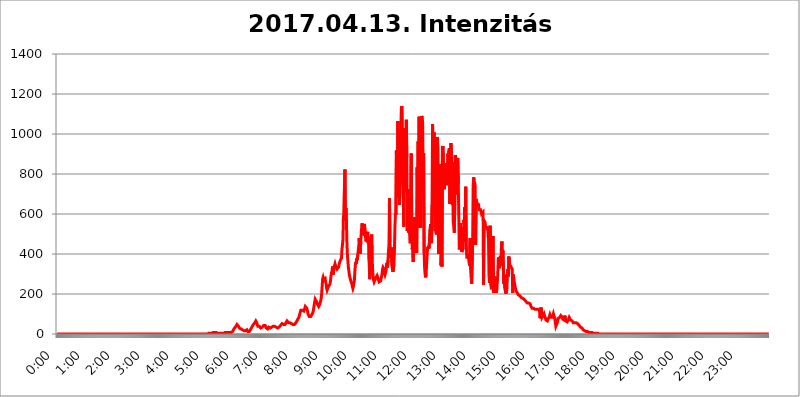
| Category | 2017.04.13. Intenzitás [W/m^2] |
|---|---|
| 0.0 | 0 |
| 0.0006944444444444445 | 0 |
| 0.001388888888888889 | 0 |
| 0.0020833333333333333 | 0 |
| 0.002777777777777778 | 0 |
| 0.003472222222222222 | 0 |
| 0.004166666666666667 | 0 |
| 0.004861111111111111 | 0 |
| 0.005555555555555556 | 0 |
| 0.0062499999999999995 | 0 |
| 0.006944444444444444 | 0 |
| 0.007638888888888889 | 0 |
| 0.008333333333333333 | 0 |
| 0.009027777777777779 | 0 |
| 0.009722222222222222 | 0 |
| 0.010416666666666666 | 0 |
| 0.011111111111111112 | 0 |
| 0.011805555555555555 | 0 |
| 0.012499999999999999 | 0 |
| 0.013194444444444444 | 0 |
| 0.013888888888888888 | 0 |
| 0.014583333333333332 | 0 |
| 0.015277777777777777 | 0 |
| 0.015972222222222224 | 0 |
| 0.016666666666666666 | 0 |
| 0.017361111111111112 | 0 |
| 0.018055555555555557 | 0 |
| 0.01875 | 0 |
| 0.019444444444444445 | 0 |
| 0.02013888888888889 | 0 |
| 0.020833333333333332 | 0 |
| 0.02152777777777778 | 0 |
| 0.022222222222222223 | 0 |
| 0.02291666666666667 | 0 |
| 0.02361111111111111 | 0 |
| 0.024305555555555556 | 0 |
| 0.024999999999999998 | 0 |
| 0.025694444444444447 | 0 |
| 0.02638888888888889 | 0 |
| 0.027083333333333334 | 0 |
| 0.027777777777777776 | 0 |
| 0.02847222222222222 | 0 |
| 0.029166666666666664 | 0 |
| 0.029861111111111113 | 0 |
| 0.030555555555555555 | 0 |
| 0.03125 | 0 |
| 0.03194444444444445 | 0 |
| 0.03263888888888889 | 0 |
| 0.03333333333333333 | 0 |
| 0.034027777777777775 | 0 |
| 0.034722222222222224 | 0 |
| 0.035416666666666666 | 0 |
| 0.036111111111111115 | 0 |
| 0.03680555555555556 | 0 |
| 0.0375 | 0 |
| 0.03819444444444444 | 0 |
| 0.03888888888888889 | 0 |
| 0.03958333333333333 | 0 |
| 0.04027777777777778 | 0 |
| 0.04097222222222222 | 0 |
| 0.041666666666666664 | 0 |
| 0.042361111111111106 | 0 |
| 0.04305555555555556 | 0 |
| 0.043750000000000004 | 0 |
| 0.044444444444444446 | 0 |
| 0.04513888888888889 | 0 |
| 0.04583333333333334 | 0 |
| 0.04652777777777778 | 0 |
| 0.04722222222222222 | 0 |
| 0.04791666666666666 | 0 |
| 0.04861111111111111 | 0 |
| 0.049305555555555554 | 0 |
| 0.049999999999999996 | 0 |
| 0.05069444444444445 | 0 |
| 0.051388888888888894 | 0 |
| 0.052083333333333336 | 0 |
| 0.05277777777777778 | 0 |
| 0.05347222222222222 | 0 |
| 0.05416666666666667 | 0 |
| 0.05486111111111111 | 0 |
| 0.05555555555555555 | 0 |
| 0.05625 | 0 |
| 0.05694444444444444 | 0 |
| 0.057638888888888885 | 0 |
| 0.05833333333333333 | 0 |
| 0.05902777777777778 | 0 |
| 0.059722222222222225 | 0 |
| 0.06041666666666667 | 0 |
| 0.061111111111111116 | 0 |
| 0.06180555555555556 | 0 |
| 0.0625 | 0 |
| 0.06319444444444444 | 0 |
| 0.06388888888888888 | 0 |
| 0.06458333333333334 | 0 |
| 0.06527777777777778 | 0 |
| 0.06597222222222222 | 0 |
| 0.06666666666666667 | 0 |
| 0.06736111111111111 | 0 |
| 0.06805555555555555 | 0 |
| 0.06874999999999999 | 0 |
| 0.06944444444444443 | 0 |
| 0.07013888888888889 | 0 |
| 0.07083333333333333 | 0 |
| 0.07152777777777779 | 0 |
| 0.07222222222222223 | 0 |
| 0.07291666666666667 | 0 |
| 0.07361111111111111 | 0 |
| 0.07430555555555556 | 0 |
| 0.075 | 0 |
| 0.07569444444444444 | 0 |
| 0.0763888888888889 | 0 |
| 0.07708333333333334 | 0 |
| 0.07777777777777778 | 0 |
| 0.07847222222222222 | 0 |
| 0.07916666666666666 | 0 |
| 0.0798611111111111 | 0 |
| 0.08055555555555556 | 0 |
| 0.08125 | 0 |
| 0.08194444444444444 | 0 |
| 0.08263888888888889 | 0 |
| 0.08333333333333333 | 0 |
| 0.08402777777777777 | 0 |
| 0.08472222222222221 | 0 |
| 0.08541666666666665 | 0 |
| 0.08611111111111112 | 0 |
| 0.08680555555555557 | 0 |
| 0.08750000000000001 | 0 |
| 0.08819444444444445 | 0 |
| 0.08888888888888889 | 0 |
| 0.08958333333333333 | 0 |
| 0.09027777777777778 | 0 |
| 0.09097222222222222 | 0 |
| 0.09166666666666667 | 0 |
| 0.09236111111111112 | 0 |
| 0.09305555555555556 | 0 |
| 0.09375 | 0 |
| 0.09444444444444444 | 0 |
| 0.09513888888888888 | 0 |
| 0.09583333333333333 | 0 |
| 0.09652777777777777 | 0 |
| 0.09722222222222222 | 0 |
| 0.09791666666666667 | 0 |
| 0.09861111111111111 | 0 |
| 0.09930555555555555 | 0 |
| 0.09999999999999999 | 0 |
| 0.10069444444444443 | 0 |
| 0.1013888888888889 | 0 |
| 0.10208333333333335 | 0 |
| 0.10277777777777779 | 0 |
| 0.10347222222222223 | 0 |
| 0.10416666666666667 | 0 |
| 0.10486111111111111 | 0 |
| 0.10555555555555556 | 0 |
| 0.10625 | 0 |
| 0.10694444444444444 | 0 |
| 0.1076388888888889 | 0 |
| 0.10833333333333334 | 0 |
| 0.10902777777777778 | 0 |
| 0.10972222222222222 | 0 |
| 0.1111111111111111 | 0 |
| 0.11180555555555556 | 0 |
| 0.11180555555555556 | 0 |
| 0.1125 | 0 |
| 0.11319444444444444 | 0 |
| 0.11388888888888889 | 0 |
| 0.11458333333333333 | 0 |
| 0.11527777777777777 | 0 |
| 0.11597222222222221 | 0 |
| 0.11666666666666665 | 0 |
| 0.1173611111111111 | 0 |
| 0.11805555555555557 | 0 |
| 0.11944444444444445 | 0 |
| 0.12013888888888889 | 0 |
| 0.12083333333333333 | 0 |
| 0.12152777777777778 | 0 |
| 0.12222222222222223 | 0 |
| 0.12291666666666667 | 0 |
| 0.12291666666666667 | 0 |
| 0.12361111111111112 | 0 |
| 0.12430555555555556 | 0 |
| 0.125 | 0 |
| 0.12569444444444444 | 0 |
| 0.12638888888888888 | 0 |
| 0.12708333333333333 | 0 |
| 0.16875 | 0 |
| 0.12847222222222224 | 0 |
| 0.12916666666666668 | 0 |
| 0.12986111111111112 | 0 |
| 0.13055555555555556 | 0 |
| 0.13125 | 0 |
| 0.13194444444444445 | 0 |
| 0.1326388888888889 | 0 |
| 0.13333333333333333 | 0 |
| 0.13402777777777777 | 0 |
| 0.13402777777777777 | 0 |
| 0.13472222222222222 | 0 |
| 0.13541666666666666 | 0 |
| 0.1361111111111111 | 0 |
| 0.13749999999999998 | 0 |
| 0.13819444444444443 | 0 |
| 0.1388888888888889 | 0 |
| 0.13958333333333334 | 0 |
| 0.14027777777777778 | 0 |
| 0.14097222222222222 | 0 |
| 0.14166666666666666 | 0 |
| 0.1423611111111111 | 0 |
| 0.14305555555555557 | 0 |
| 0.14375000000000002 | 0 |
| 0.14444444444444446 | 0 |
| 0.1451388888888889 | 0 |
| 0.1451388888888889 | 0 |
| 0.14652777777777778 | 0 |
| 0.14722222222222223 | 0 |
| 0.14791666666666667 | 0 |
| 0.1486111111111111 | 0 |
| 0.14930555555555555 | 0 |
| 0.15 | 0 |
| 0.15069444444444444 | 0 |
| 0.15138888888888888 | 0 |
| 0.15208333333333332 | 0 |
| 0.15277777777777776 | 0 |
| 0.15347222222222223 | 0 |
| 0.15416666666666667 | 0 |
| 0.15486111111111112 | 0 |
| 0.15555555555555556 | 0 |
| 0.15625 | 0 |
| 0.15694444444444444 | 0 |
| 0.15763888888888888 | 0 |
| 0.15833333333333333 | 0 |
| 0.15902777777777777 | 0 |
| 0.15972222222222224 | 0 |
| 0.16041666666666668 | 0 |
| 0.16111111111111112 | 0 |
| 0.16180555555555556 | 0 |
| 0.1625 | 0 |
| 0.16319444444444445 | 0 |
| 0.1638888888888889 | 0 |
| 0.16458333333333333 | 0 |
| 0.16527777777777777 | 0 |
| 0.16597222222222222 | 0 |
| 0.16666666666666666 | 0 |
| 0.1673611111111111 | 0 |
| 0.16805555555555554 | 0 |
| 0.16874999999999998 | 0 |
| 0.16944444444444443 | 0 |
| 0.17013888888888887 | 0 |
| 0.1708333333333333 | 0 |
| 0.17152777777777775 | 0 |
| 0.17222222222222225 | 0 |
| 0.1729166666666667 | 0 |
| 0.17361111111111113 | 0 |
| 0.17430555555555557 | 0 |
| 0.17500000000000002 | 0 |
| 0.17569444444444446 | 0 |
| 0.1763888888888889 | 0 |
| 0.17708333333333334 | 0 |
| 0.17777777777777778 | 0 |
| 0.17847222222222223 | 0 |
| 0.17916666666666667 | 0 |
| 0.1798611111111111 | 0 |
| 0.18055555555555555 | 0 |
| 0.18125 | 0 |
| 0.18194444444444444 | 0 |
| 0.1826388888888889 | 0 |
| 0.18333333333333335 | 0 |
| 0.1840277777777778 | 0 |
| 0.18472222222222223 | 0 |
| 0.18541666666666667 | 0 |
| 0.18611111111111112 | 0 |
| 0.18680555555555556 | 0 |
| 0.1875 | 0 |
| 0.18819444444444444 | 0 |
| 0.18888888888888888 | 0 |
| 0.18958333333333333 | 0 |
| 0.19027777777777777 | 0 |
| 0.1909722222222222 | 0 |
| 0.19166666666666665 | 0 |
| 0.19236111111111112 | 0 |
| 0.19305555555555554 | 0 |
| 0.19375 | 0 |
| 0.19444444444444445 | 0 |
| 0.1951388888888889 | 0 |
| 0.19583333333333333 | 0 |
| 0.19652777777777777 | 0 |
| 0.19722222222222222 | 0 |
| 0.19791666666666666 | 0 |
| 0.1986111111111111 | 0 |
| 0.19930555555555554 | 0 |
| 0.19999999999999998 | 0 |
| 0.20069444444444443 | 0 |
| 0.20138888888888887 | 0 |
| 0.2020833333333333 | 0 |
| 0.2027777777777778 | 0 |
| 0.2034722222222222 | 0 |
| 0.2041666666666667 | 0 |
| 0.20486111111111113 | 0 |
| 0.20555555555555557 | 0 |
| 0.20625000000000002 | 0 |
| 0.20694444444444446 | 0 |
| 0.2076388888888889 | 0 |
| 0.20833333333333334 | 0 |
| 0.20902777777777778 | 0 |
| 0.20972222222222223 | 0 |
| 0.21041666666666667 | 0 |
| 0.2111111111111111 | 0 |
| 0.21180555555555555 | 3.525 |
| 0.2125 | 3.525 |
| 0.21319444444444444 | 3.525 |
| 0.2138888888888889 | 3.525 |
| 0.21458333333333335 | 3.525 |
| 0.2152777777777778 | 3.525 |
| 0.21597222222222223 | 3.525 |
| 0.21666666666666667 | 3.525 |
| 0.21736111111111112 | 3.525 |
| 0.21805555555555556 | 7.887 |
| 0.21875 | 7.887 |
| 0.21944444444444444 | 7.887 |
| 0.22013888888888888 | 7.887 |
| 0.22083333333333333 | 7.887 |
| 0.22152777777777777 | 12.257 |
| 0.2222222222222222 | 7.887 |
| 0.22291666666666665 | 7.887 |
| 0.2236111111111111 | 7.887 |
| 0.22430555555555556 | 7.887 |
| 0.225 | 3.525 |
| 0.22569444444444445 | 3.525 |
| 0.2263888888888889 | 3.525 |
| 0.22708333333333333 | 3.525 |
| 0.22777777777777777 | 3.525 |
| 0.22847222222222222 | 3.525 |
| 0.22916666666666666 | 3.525 |
| 0.2298611111111111 | 3.525 |
| 0.23055555555555554 | 3.525 |
| 0.23124999999999998 | 3.525 |
| 0.23194444444444443 | 3.525 |
| 0.23263888888888887 | 3.525 |
| 0.2333333333333333 | 3.525 |
| 0.2340277777777778 | 3.525 |
| 0.2347222222222222 | 7.887 |
| 0.2354166666666667 | 7.887 |
| 0.23611111111111113 | 7.887 |
| 0.23680555555555557 | 7.887 |
| 0.23750000000000002 | 7.887 |
| 0.23819444444444446 | 7.887 |
| 0.2388888888888889 | 7.887 |
| 0.23958333333333334 | 7.887 |
| 0.24027777777777778 | 7.887 |
| 0.24097222222222223 | 7.887 |
| 0.24166666666666667 | 7.887 |
| 0.2423611111111111 | 7.887 |
| 0.24305555555555555 | 7.887 |
| 0.24375 | 7.887 |
| 0.24444444444444446 | 7.887 |
| 0.24513888888888888 | 12.257 |
| 0.24583333333333335 | 12.257 |
| 0.2465277777777778 | 16.636 |
| 0.24722222222222223 | 21.024 |
| 0.24791666666666667 | 25.419 |
| 0.24861111111111112 | 29.823 |
| 0.24930555555555556 | 29.823 |
| 0.25 | 34.234 |
| 0.25069444444444444 | 38.653 |
| 0.2513888888888889 | 38.653 |
| 0.2520833333333333 | 47.511 |
| 0.25277777777777777 | 47.511 |
| 0.2534722222222222 | 43.079 |
| 0.25416666666666665 | 38.653 |
| 0.2548611111111111 | 34.234 |
| 0.2555555555555556 | 29.823 |
| 0.25625000000000003 | 25.419 |
| 0.2569444444444445 | 25.419 |
| 0.2576388888888889 | 25.419 |
| 0.25833333333333336 | 21.024 |
| 0.2590277777777778 | 21.024 |
| 0.25972222222222224 | 21.024 |
| 0.2604166666666667 | 16.636 |
| 0.2611111111111111 | 16.636 |
| 0.26180555555555557 | 16.636 |
| 0.2625 | 16.636 |
| 0.26319444444444445 | 16.636 |
| 0.2638888888888889 | 16.636 |
| 0.26458333333333334 | 16.636 |
| 0.2652777777777778 | 21.024 |
| 0.2659722222222222 | 21.024 |
| 0.26666666666666666 | 16.636 |
| 0.2673611111111111 | 12.257 |
| 0.26805555555555555 | 12.257 |
| 0.26875 | 12.257 |
| 0.26944444444444443 | 12.257 |
| 0.2701388888888889 | 12.257 |
| 0.2708333333333333 | 21.024 |
| 0.27152777777777776 | 25.419 |
| 0.2722222222222222 | 29.823 |
| 0.27291666666666664 | 34.234 |
| 0.2736111111111111 | 38.653 |
| 0.2743055555555555 | 43.079 |
| 0.27499999999999997 | 47.511 |
| 0.27569444444444446 | 51.951 |
| 0.27638888888888885 | 51.951 |
| 0.27708333333333335 | 56.398 |
| 0.2777777777777778 | 60.85 |
| 0.27847222222222223 | 65.31 |
| 0.2791666666666667 | 65.31 |
| 0.2798611111111111 | 56.398 |
| 0.28055555555555556 | 47.511 |
| 0.28125 | 38.653 |
| 0.28194444444444444 | 38.653 |
| 0.2826388888888889 | 38.653 |
| 0.2833333333333333 | 38.653 |
| 0.28402777777777777 | 38.653 |
| 0.2847222222222222 | 34.234 |
| 0.28541666666666665 | 29.823 |
| 0.28611111111111115 | 29.823 |
| 0.28680555555555554 | 29.823 |
| 0.28750000000000003 | 34.234 |
| 0.2881944444444445 | 34.234 |
| 0.2888888888888889 | 38.653 |
| 0.28958333333333336 | 43.079 |
| 0.2902777777777778 | 47.511 |
| 0.29097222222222224 | 47.511 |
| 0.2916666666666667 | 43.079 |
| 0.2923611111111111 | 38.653 |
| 0.29305555555555557 | 29.823 |
| 0.29375 | 25.419 |
| 0.29444444444444445 | 25.419 |
| 0.2951388888888889 | 25.419 |
| 0.29583333333333334 | 29.823 |
| 0.2965277777777778 | 34.234 |
| 0.2972222222222222 | 34.234 |
| 0.29791666666666666 | 29.823 |
| 0.2986111111111111 | 29.823 |
| 0.29930555555555555 | 29.823 |
| 0.3 | 29.823 |
| 0.30069444444444443 | 34.234 |
| 0.3013888888888889 | 34.234 |
| 0.3020833333333333 | 34.234 |
| 0.30277777777777776 | 38.653 |
| 0.3034722222222222 | 38.653 |
| 0.30416666666666664 | 38.653 |
| 0.3048611111111111 | 38.653 |
| 0.3055555555555555 | 38.653 |
| 0.30624999999999997 | 34.234 |
| 0.3069444444444444 | 34.234 |
| 0.3076388888888889 | 29.823 |
| 0.30833333333333335 | 29.823 |
| 0.3090277777777778 | 29.823 |
| 0.30972222222222223 | 34.234 |
| 0.3104166666666667 | 34.234 |
| 0.3111111111111111 | 34.234 |
| 0.31180555555555556 | 38.653 |
| 0.3125 | 38.653 |
| 0.31319444444444444 | 43.079 |
| 0.3138888888888889 | 38.653 |
| 0.3145833333333333 | 43.079 |
| 0.31527777777777777 | 51.951 |
| 0.3159722222222222 | 51.951 |
| 0.31666666666666665 | 51.951 |
| 0.31736111111111115 | 47.511 |
| 0.31805555555555554 | 47.511 |
| 0.31875000000000003 | 47.511 |
| 0.3194444444444445 | 47.511 |
| 0.3201388888888889 | 51.951 |
| 0.32083333333333336 | 56.398 |
| 0.3215277777777778 | 60.85 |
| 0.32222222222222224 | 65.31 |
| 0.3229166666666667 | 65.31 |
| 0.3236111111111111 | 60.85 |
| 0.32430555555555557 | 56.398 |
| 0.325 | 51.951 |
| 0.32569444444444445 | 51.951 |
| 0.3263888888888889 | 56.398 |
| 0.32708333333333334 | 56.398 |
| 0.3277777777777778 | 51.951 |
| 0.3284722222222222 | 51.951 |
| 0.32916666666666666 | 51.951 |
| 0.3298611111111111 | 51.951 |
| 0.33055555555555555 | 47.511 |
| 0.33125 | 47.511 |
| 0.33194444444444443 | 47.511 |
| 0.3326388888888889 | 47.511 |
| 0.3333333333333333 | 51.951 |
| 0.3340277777777778 | 51.951 |
| 0.3347222222222222 | 56.398 |
| 0.3354166666666667 | 60.85 |
| 0.3361111111111111 | 65.31 |
| 0.3368055555555556 | 69.775 |
| 0.33749999999999997 | 74.246 |
| 0.33819444444444446 | 78.722 |
| 0.33888888888888885 | 83.205 |
| 0.33958333333333335 | 92.184 |
| 0.34027777777777773 | 96.682 |
| 0.34097222222222223 | 110.201 |
| 0.3416666666666666 | 119.235 |
| 0.3423611111111111 | 123.758 |
| 0.3430555555555555 | 123.758 |
| 0.34375 | 119.235 |
| 0.3444444444444445 | 119.235 |
| 0.3451388888888889 | 114.716 |
| 0.3458333333333334 | 114.716 |
| 0.34652777777777777 | 119.235 |
| 0.34722222222222227 | 128.284 |
| 0.34791666666666665 | 137.347 |
| 0.34861111111111115 | 137.347 |
| 0.34930555555555554 | 137.347 |
| 0.35000000000000003 | 128.284 |
| 0.3506944444444444 | 119.235 |
| 0.3513888888888889 | 105.69 |
| 0.3520833333333333 | 96.682 |
| 0.3527777777777778 | 92.184 |
| 0.3534722222222222 | 87.692 |
| 0.3541666666666667 | 87.692 |
| 0.3548611111111111 | 83.205 |
| 0.35555555555555557 | 87.692 |
| 0.35625 | 92.184 |
| 0.35694444444444445 | 96.682 |
| 0.3576388888888889 | 101.184 |
| 0.35833333333333334 | 105.69 |
| 0.3590277777777778 | 114.716 |
| 0.3597222222222222 | 128.284 |
| 0.36041666666666666 | 146.423 |
| 0.3611111111111111 | 160.056 |
| 0.36180555555555555 | 173.709 |
| 0.3625 | 173.709 |
| 0.36319444444444443 | 169.156 |
| 0.3638888888888889 | 160.056 |
| 0.3645833333333333 | 155.509 |
| 0.3652777777777778 | 146.423 |
| 0.3659722222222222 | 141.884 |
| 0.3666666666666667 | 137.347 |
| 0.3673611111111111 | 141.884 |
| 0.3680555555555556 | 146.423 |
| 0.36874999999999997 | 150.964 |
| 0.36944444444444446 | 164.605 |
| 0.37013888888888885 | 178.264 |
| 0.37083333333333335 | 201.058 |
| 0.37152777777777773 | 237.564 |
| 0.37222222222222223 | 274.047 |
| 0.3729166666666666 | 283.156 |
| 0.3736111111111111 | 274.047 |
| 0.3743055555555555 | 269.49 |
| 0.375 | 274.047 |
| 0.3756944444444445 | 278.603 |
| 0.3763888888888889 | 260.373 |
| 0.3770833333333334 | 251.251 |
| 0.37777777777777777 | 228.436 |
| 0.37847222222222227 | 219.309 |
| 0.37916666666666665 | 219.309 |
| 0.37986111111111115 | 233 |
| 0.38055555555555554 | 237.564 |
| 0.38125000000000003 | 242.127 |
| 0.3819444444444444 | 237.564 |
| 0.3826388888888889 | 251.251 |
| 0.3833333333333333 | 269.49 |
| 0.3840277777777778 | 292.259 |
| 0.3847222222222222 | 305.898 |
| 0.3854166666666667 | 314.98 |
| 0.3861111111111111 | 337.639 |
| 0.38680555555555557 | 296.808 |
| 0.3875 | 310.44 |
| 0.38819444444444445 | 333.113 |
| 0.3888888888888889 | 342.162 |
| 0.38958333333333334 | 351.198 |
| 0.3902777777777778 | 342.162 |
| 0.3909722222222222 | 333.113 |
| 0.39166666666666666 | 328.584 |
| 0.3923611111111111 | 324.052 |
| 0.39305555555555555 | 319.517 |
| 0.39375 | 324.052 |
| 0.39444444444444443 | 333.113 |
| 0.3951388888888889 | 333.113 |
| 0.3958333333333333 | 355.712 |
| 0.3965277777777778 | 351.198 |
| 0.3972222222222222 | 369.23 |
| 0.3979166666666667 | 369.23 |
| 0.3986111111111111 | 378.224 |
| 0.3993055555555556 | 422.943 |
| 0.39999999999999997 | 445.129 |
| 0.40069444444444446 | 471.582 |
| 0.40138888888888885 | 592.233 |
| 0.40208333333333335 | 566.793 |
| 0.40277777777777773 | 723.889 |
| 0.40347222222222223 | 822.26 |
| 0.4041666666666666 | 579.542 |
| 0.4048611111111111 | 629.948 |
| 0.4055555555555555 | 571.049 |
| 0.40625 | 453.968 |
| 0.4069444444444445 | 396.164 |
| 0.4076388888888889 | 364.728 |
| 0.4083333333333334 | 333.113 |
| 0.40902777777777777 | 314.98 |
| 0.40972222222222227 | 296.808 |
| 0.41041666666666665 | 283.156 |
| 0.41111111111111115 | 274.047 |
| 0.41180555555555554 | 264.932 |
| 0.41250000000000003 | 260.373 |
| 0.4131944444444444 | 251.251 |
| 0.4138888888888889 | 237.564 |
| 0.4145833333333333 | 228.436 |
| 0.4152777777777778 | 237.564 |
| 0.4159722222222222 | 242.127 |
| 0.4166666666666667 | 264.932 |
| 0.4173611111111111 | 310.44 |
| 0.41805555555555557 | 342.162 |
| 0.41875 | 360.221 |
| 0.41944444444444445 | 351.198 |
| 0.4201388888888889 | 378.224 |
| 0.42083333333333334 | 369.23 |
| 0.4215277777777778 | 396.164 |
| 0.4222222222222222 | 418.492 |
| 0.42291666666666666 | 440.702 |
| 0.4236111111111111 | 480.356 |
| 0.42430555555555555 | 409.574 |
| 0.425 | 400.638 |
| 0.42569444444444443 | 467.187 |
| 0.4263888888888889 | 506.542 |
| 0.4270833333333333 | 536.82 |
| 0.4277777777777778 | 553.986 |
| 0.4284722222222222 | 493.475 |
| 0.4291666666666667 | 497.836 |
| 0.4298611111111111 | 506.542 |
| 0.4305555555555556 | 549.704 |
| 0.43124999999999997 | 541.121 |
| 0.43194444444444446 | 515.223 |
| 0.43263888888888885 | 471.582 |
| 0.43333333333333335 | 462.786 |
| 0.43402777777777773 | 484.735 |
| 0.43472222222222223 | 489.108 |
| 0.4354166666666666 | 510.885 |
| 0.4361111111111111 | 453.968 |
| 0.4368055555555555 | 484.735 |
| 0.4375 | 360.221 |
| 0.4381944444444445 | 274.047 |
| 0.4388888888888889 | 274.047 |
| 0.4395833333333334 | 324.052 |
| 0.44027777777777777 | 453.968 |
| 0.44097222222222227 | 497.836 |
| 0.44166666666666665 | 378.224 |
| 0.44236111111111115 | 319.517 |
| 0.44305555555555554 | 287.709 |
| 0.44375000000000003 | 269.49 |
| 0.4444444444444444 | 260.373 |
| 0.4451388888888889 | 260.373 |
| 0.4458333333333333 | 264.932 |
| 0.4465277777777778 | 278.603 |
| 0.4472222222222222 | 278.603 |
| 0.4479166666666667 | 283.156 |
| 0.4486111111111111 | 292.259 |
| 0.44930555555555557 | 287.709 |
| 0.45 | 278.603 |
| 0.45069444444444445 | 269.49 |
| 0.4513888888888889 | 260.373 |
| 0.45208333333333334 | 264.932 |
| 0.4527777777777778 | 264.932 |
| 0.4534722222222222 | 264.932 |
| 0.45416666666666666 | 269.49 |
| 0.4548611111111111 | 287.709 |
| 0.45555555555555555 | 301.354 |
| 0.45625 | 324.052 |
| 0.45694444444444443 | 333.113 |
| 0.4576388888888889 | 333.113 |
| 0.4583333333333333 | 324.052 |
| 0.4590277777777778 | 305.898 |
| 0.4597222222222222 | 296.808 |
| 0.4604166666666667 | 301.354 |
| 0.4611111111111111 | 314.98 |
| 0.4618055555555556 | 342.162 |
| 0.46249999999999997 | 355.712 |
| 0.46319444444444446 | 333.113 |
| 0.46388888888888885 | 369.23 |
| 0.46458333333333335 | 414.035 |
| 0.46527777777777773 | 445.129 |
| 0.46597222222222223 | 679.395 |
| 0.4666666666666666 | 458.38 |
| 0.4673611111111111 | 418.492 |
| 0.4680555555555555 | 378.224 |
| 0.46875 | 431.833 |
| 0.4694444444444445 | 342.162 |
| 0.4701388888888889 | 324.052 |
| 0.4708333333333334 | 310.44 |
| 0.47152777777777777 | 305.898 |
| 0.47222222222222227 | 346.682 |
| 0.47291666666666665 | 418.492 |
| 0.47361111111111115 | 532.513 |
| 0.47430555555555554 | 604.864 |
| 0.47500000000000003 | 596.45 |
| 0.4756944444444444 | 917.534 |
| 0.4763888888888889 | 727.896 |
| 0.4770833333333333 | 683.473 |
| 0.4777777777777778 | 1063.51 |
| 0.4784722222222222 | 958.814 |
| 0.4791666666666667 | 966.295 |
| 0.4798611111111111 | 646.537 |
| 0.48055555555555557 | 719.877 |
| 0.48125 | 767.62 |
| 0.48194444444444445 | 1037.277 |
| 0.4826388888888889 | 1127.879 |
| 0.48333333333333334 | 1139.384 |
| 0.4840277777777778 | 1139.384 |
| 0.4847222222222222 | 751.803 |
| 0.48541666666666666 | 654.791 |
| 0.4861111111111111 | 536.82 |
| 0.48680555555555555 | 1029.798 |
| 0.4875 | 1029.798 |
| 0.48819444444444443 | 711.832 |
| 0.4888888888888889 | 875.918 |
| 0.4895833333333333 | 1071.027 |
| 0.4902777777777778 | 887.309 |
| 0.4909722222222222 | 515.223 |
| 0.4916666666666667 | 723.889 |
| 0.4923611111111111 | 675.311 |
| 0.4930555555555556 | 506.542 |
| 0.49374999999999997 | 600.661 |
| 0.49444444444444446 | 497.836 |
| 0.49513888888888885 | 453.968 |
| 0.49583333333333335 | 449.551 |
| 0.49652777777777773 | 902.447 |
| 0.49722222222222223 | 528.2 |
| 0.4979166666666666 | 422.943 |
| 0.4986111111111111 | 449.551 |
| 0.4993055555555555 | 360.221 |
| 0.5 | 528.2 |
| 0.5006944444444444 | 558.261 |
| 0.5013888888888889 | 583.779 |
| 0.5020833333333333 | 506.542 |
| 0.5027777777777778 | 449.551 |
| 0.5034722222222222 | 427.39 |
| 0.5041666666666667 | 405.108 |
| 0.5048611111111111 | 833.834 |
| 0.5055555555555555 | 642.4 |
| 0.50625 | 962.555 |
| 0.5069444444444444 | 536.82 |
| 0.5076388888888889 | 1086.097 |
| 0.5083333333333333 | 532.513 |
| 0.5090277777777777 | 1007.383 |
| 0.5097222222222222 | 532.513 |
| 0.5104166666666666 | 536.82 |
| 0.5111111111111112 | 1089.873 |
| 0.5118055555555555 | 1082.324 |
| 0.5125000000000001 | 1056.004 |
| 0.5131944444444444 | 759.723 |
| 0.513888888888889 | 902.447 |
| 0.5145833333333333 | 405.108 |
| 0.5152777777777778 | 328.584 |
| 0.5159722222222222 | 296.808 |
| 0.5166666666666667 | 283.156 |
| 0.517361111111111 | 296.808 |
| 0.5180555555555556 | 351.198 |
| 0.5187499999999999 | 391.685 |
| 0.5194444444444445 | 436.27 |
| 0.5201388888888888 | 427.39 |
| 0.5208333333333334 | 440.702 |
| 0.5215277777777778 | 427.39 |
| 0.5222222222222223 | 431.833 |
| 0.5229166666666667 | 523.88 |
| 0.5236111111111111 | 549.704 |
| 0.5243055555555556 | 475.972 |
| 0.525 | 453.968 |
| 0.5256944444444445 | 646.537 |
| 0.5263888888888889 | 1048.508 |
| 0.5270833333333333 | 802.868 |
| 0.5277777777777778 | 783.342 |
| 0.5284722222222222 | 1007.383 |
| 0.5291666666666667 | 663.019 |
| 0.5298611111111111 | 515.223 |
| 0.5305555555555556 | 977.508 |
| 0.53125 | 506.542 |
| 0.5319444444444444 | 497.836 |
| 0.5326388888888889 | 984.98 |
| 0.5333333333333333 | 970.034 |
| 0.5340277777777778 | 928.819 |
| 0.5347222222222222 | 400.638 |
| 0.5354166666666667 | 545.416 |
| 0.5361111111111111 | 849.199 |
| 0.5368055555555555 | 528.2 |
| 0.5375 | 510.885 |
| 0.5381944444444444 | 342.162 |
| 0.5388888888888889 | 391.685 |
| 0.5395833333333333 | 337.639 |
| 0.5402777777777777 | 932.576 |
| 0.5409722222222222 | 940.082 |
| 0.5416666666666666 | 845.365 |
| 0.5423611111111112 | 818.392 |
| 0.5430555555555555 | 723.889 |
| 0.5437500000000001 | 810.641 |
| 0.5444444444444444 | 814.519 |
| 0.545138888888889 | 779.42 |
| 0.5458333333333333 | 853.029 |
| 0.5465277777777778 | 814.519 |
| 0.5472222222222222 | 743.859 |
| 0.5479166666666667 | 902.447 |
| 0.548611111111111 | 883.516 |
| 0.5493055555555556 | 917.534 |
| 0.5499999999999999 | 928.819 |
| 0.5506944444444445 | 650.667 |
| 0.5513888888888888 | 775.492 |
| 0.5520833333333334 | 955.071 |
| 0.5527777777777778 | 955.071 |
| 0.5534722222222223 | 875.918 |
| 0.5541666666666667 | 646.537 |
| 0.5548611111111111 | 856.855 |
| 0.5555555555555556 | 558.261 |
| 0.55625 | 562.53 |
| 0.5569444444444445 | 506.542 |
| 0.5576388888888889 | 687.544 |
| 0.5583333333333333 | 894.885 |
| 0.5590277777777778 | 875.918 |
| 0.5597222222222222 | 727.896 |
| 0.5604166666666667 | 695.666 |
| 0.5611111111111111 | 868.305 |
| 0.5618055555555556 | 879.719 |
| 0.5625 | 747.834 |
| 0.5631944444444444 | 588.009 |
| 0.5638888888888889 | 422.943 |
| 0.5645833333333333 | 436.27 |
| 0.5652777777777778 | 553.986 |
| 0.5659722222222222 | 431.833 |
| 0.5666666666666667 | 497.836 |
| 0.5673611111111111 | 409.574 |
| 0.5680555555555555 | 418.492 |
| 0.56875 | 422.943 |
| 0.5694444444444444 | 427.39 |
| 0.5701388888888889 | 571.049 |
| 0.5708333333333333 | 549.704 |
| 0.5715277777777777 | 634.105 |
| 0.5722222222222222 | 553.986 |
| 0.5729166666666666 | 735.89 |
| 0.5736111111111112 | 458.38 |
| 0.5743055555555555 | 391.685 |
| 0.5750000000000001 | 378.224 |
| 0.5756944444444444 | 400.638 |
| 0.576388888888889 | 391.685 |
| 0.5770833333333333 | 373.729 |
| 0.5777777777777778 | 351.198 |
| 0.5784722222222222 | 342.162 |
| 0.5791666666666667 | 480.356 |
| 0.579861111111111 | 319.517 |
| 0.5805555555555556 | 278.603 |
| 0.5812499999999999 | 251.251 |
| 0.5819444444444445 | 255.813 |
| 0.5826388888888888 | 471.582 |
| 0.5833333333333334 | 739.877 |
| 0.5840277777777778 | 783.342 |
| 0.5847222222222223 | 767.62 |
| 0.5854166666666667 | 763.674 |
| 0.5861111111111111 | 743.859 |
| 0.5868055555555556 | 445.129 |
| 0.5875 | 675.311 |
| 0.5881944444444445 | 642.4 |
| 0.5888888888888889 | 654.791 |
| 0.5895833333333333 | 654.791 |
| 0.5902777777777778 | 654.791 |
| 0.5909722222222222 | 646.537 |
| 0.5916666666666667 | 621.613 |
| 0.5923611111111111 | 617.436 |
| 0.5930555555555556 | 621.613 |
| 0.59375 | 621.613 |
| 0.5944444444444444 | 613.252 |
| 0.5951388888888889 | 600.661 |
| 0.5958333333333333 | 596.45 |
| 0.5965277777777778 | 600.661 |
| 0.5972222222222222 | 609.062 |
| 0.5979166666666667 | 246.689 |
| 0.5986111111111111 | 566.793 |
| 0.5993055555555555 | 566.793 |
| 0.6 | 558.261 |
| 0.6006944444444444 | 536.82 |
| 0.6013888888888889 | 541.121 |
| 0.6020833333333333 | 541.121 |
| 0.6027777777777777 | 532.513 |
| 0.6034722222222222 | 519.555 |
| 0.6041666666666666 | 532.513 |
| 0.6048611111111112 | 467.187 |
| 0.6055555555555555 | 292.259 |
| 0.6062500000000001 | 255.813 |
| 0.6069444444444444 | 541.121 |
| 0.607638888888889 | 541.121 |
| 0.6083333333333333 | 242.127 |
| 0.6090277777777778 | 223.873 |
| 0.6097222222222222 | 219.309 |
| 0.6104166666666667 | 219.309 |
| 0.611111111111111 | 489.108 |
| 0.6118055555555556 | 205.62 |
| 0.6124999999999999 | 223.873 |
| 0.6131944444444445 | 287.709 |
| 0.6138888888888888 | 246.689 |
| 0.6145833333333334 | 242.127 |
| 0.6152777777777778 | 219.309 |
| 0.6159722222222223 | 205.62 |
| 0.6166666666666667 | 237.564 |
| 0.6173611111111111 | 264.932 |
| 0.6180555555555556 | 319.517 |
| 0.61875 | 382.715 |
| 0.6194444444444445 | 351.198 |
| 0.6201388888888889 | 328.584 |
| 0.6208333333333333 | 369.23 |
| 0.6215277777777778 | 369.23 |
| 0.6222222222222222 | 360.221 |
| 0.6229166666666667 | 431.833 |
| 0.6236111111111111 | 462.786 |
| 0.6243055555555556 | 382.715 |
| 0.625 | 418.492 |
| 0.6256944444444444 | 414.035 |
| 0.6263888888888889 | 251.251 |
| 0.6270833333333333 | 296.808 |
| 0.6277777777777778 | 228.436 |
| 0.6284722222222222 | 228.436 |
| 0.6291666666666667 | 201.058 |
| 0.6298611111111111 | 201.058 |
| 0.6305555555555555 | 219.309 |
| 0.63125 | 283.156 |
| 0.6319444444444444 | 324.052 |
| 0.6326388888888889 | 287.709 |
| 0.6333333333333333 | 387.202 |
| 0.6340277777777777 | 369.23 |
| 0.6347222222222222 | 346.682 |
| 0.6354166666666666 | 342.162 |
| 0.6361111111111112 | 342.162 |
| 0.6368055555555555 | 333.113 |
| 0.6375000000000001 | 333.113 |
| 0.6381944444444444 | 324.052 |
| 0.638888888888889 | 205.62 |
| 0.6395833333333333 | 296.808 |
| 0.6402777777777778 | 278.603 |
| 0.6409722222222222 | 260.373 |
| 0.6416666666666667 | 246.689 |
| 0.642361111111111 | 233 |
| 0.6430555555555556 | 228.436 |
| 0.6437499999999999 | 214.746 |
| 0.6444444444444445 | 210.182 |
| 0.6451388888888888 | 205.62 |
| 0.6458333333333334 | 201.058 |
| 0.6465277777777778 | 196.497 |
| 0.6472222222222223 | 191.937 |
| 0.6479166666666667 | 191.937 |
| 0.6486111111111111 | 191.937 |
| 0.6493055555555556 | 187.378 |
| 0.65 | 187.378 |
| 0.6506944444444445 | 182.82 |
| 0.6513888888888889 | 178.264 |
| 0.6520833333333333 | 178.264 |
| 0.6527777777777778 | 178.264 |
| 0.6534722222222222 | 173.709 |
| 0.6541666666666667 | 173.709 |
| 0.6548611111111111 | 173.709 |
| 0.6555555555555556 | 169.156 |
| 0.65625 | 169.156 |
| 0.6569444444444444 | 164.605 |
| 0.6576388888888889 | 164.605 |
| 0.6583333333333333 | 160.056 |
| 0.6590277777777778 | 155.509 |
| 0.6597222222222222 | 155.509 |
| 0.6604166666666667 | 155.509 |
| 0.6611111111111111 | 155.509 |
| 0.6618055555555555 | 150.964 |
| 0.6625 | 150.964 |
| 0.6631944444444444 | 150.964 |
| 0.6638888888888889 | 146.423 |
| 0.6645833333333333 | 137.347 |
| 0.6652777777777777 | 132.814 |
| 0.6659722222222222 | 128.284 |
| 0.6666666666666666 | 128.284 |
| 0.6673611111111111 | 128.284 |
| 0.6680555555555556 | 128.284 |
| 0.6687500000000001 | 128.284 |
| 0.6694444444444444 | 123.758 |
| 0.6701388888888888 | 123.758 |
| 0.6708333333333334 | 123.758 |
| 0.6715277777777778 | 123.758 |
| 0.6722222222222222 | 123.758 |
| 0.6729166666666666 | 123.758 |
| 0.6736111111111112 | 123.758 |
| 0.6743055555555556 | 123.758 |
| 0.6749999999999999 | 123.758 |
| 0.6756944444444444 | 119.235 |
| 0.6763888888888889 | 119.235 |
| 0.6770833333333334 | 78.722 |
| 0.6777777777777777 | 92.184 |
| 0.6784722222222223 | 132.814 |
| 0.6791666666666667 | 110.201 |
| 0.6798611111111111 | 83.205 |
| 0.6805555555555555 | 87.692 |
| 0.68125 | 92.184 |
| 0.6819444444444445 | 96.682 |
| 0.6826388888888889 | 101.184 |
| 0.6833333333333332 | 92.184 |
| 0.6840277777777778 | 87.692 |
| 0.6847222222222222 | 78.722 |
| 0.6854166666666667 | 69.775 |
| 0.686111111111111 | 65.31 |
| 0.6868055555555556 | 65.31 |
| 0.6875 | 65.31 |
| 0.6881944444444444 | 69.775 |
| 0.688888888888889 | 78.722 |
| 0.6895833333333333 | 83.205 |
| 0.6902777777777778 | 87.692 |
| 0.6909722222222222 | 96.682 |
| 0.6916666666666668 | 92.184 |
| 0.6923611111111111 | 83.205 |
| 0.6930555555555555 | 83.205 |
| 0.69375 | 83.205 |
| 0.6944444444444445 | 83.205 |
| 0.6951388888888889 | 87.692 |
| 0.6958333333333333 | 101.184 |
| 0.6965277777777777 | 92.184 |
| 0.6972222222222223 | 92.184 |
| 0.6979166666666666 | 78.722 |
| 0.6986111111111111 | 56.398 |
| 0.6993055555555556 | 38.653 |
| 0.7000000000000001 | 34.234 |
| 0.7006944444444444 | 43.079 |
| 0.7013888888888888 | 56.398 |
| 0.7020833333333334 | 69.775 |
| 0.7027777777777778 | 78.722 |
| 0.7034722222222222 | 83.205 |
| 0.7041666666666666 | 78.722 |
| 0.7048611111111112 | 83.205 |
| 0.7055555555555556 | 87.692 |
| 0.7062499999999999 | 92.184 |
| 0.7069444444444444 | 92.184 |
| 0.7076388888888889 | 87.692 |
| 0.7083333333333334 | 83.205 |
| 0.7090277777777777 | 74.246 |
| 0.7097222222222223 | 69.775 |
| 0.7104166666666667 | 69.775 |
| 0.7111111111111111 | 69.775 |
| 0.7118055555555555 | 92.184 |
| 0.7125 | 87.692 |
| 0.7131944444444445 | 65.31 |
| 0.7138888888888889 | 60.85 |
| 0.7145833333333332 | 60.85 |
| 0.7152777777777778 | 60.85 |
| 0.7159722222222222 | 65.31 |
| 0.7166666666666667 | 69.775 |
| 0.717361111111111 | 69.775 |
| 0.7180555555555556 | 83.205 |
| 0.71875 | 83.205 |
| 0.7194444444444444 | 78.722 |
| 0.720138888888889 | 69.775 |
| 0.7208333333333333 | 74.246 |
| 0.7215277777777778 | 69.775 |
| 0.7222222222222222 | 65.31 |
| 0.7229166666666668 | 60.85 |
| 0.7236111111111111 | 56.398 |
| 0.7243055555555555 | 56.398 |
| 0.725 | 56.398 |
| 0.7256944444444445 | 56.398 |
| 0.7263888888888889 | 56.398 |
| 0.7270833333333333 | 56.398 |
| 0.7277777777777777 | 56.398 |
| 0.7284722222222223 | 56.398 |
| 0.7291666666666666 | 56.398 |
| 0.7298611111111111 | 51.951 |
| 0.7305555555555556 | 47.511 |
| 0.7312500000000001 | 47.511 |
| 0.7319444444444444 | 43.079 |
| 0.7326388888888888 | 38.653 |
| 0.7333333333333334 | 38.653 |
| 0.7340277777777778 | 34.234 |
| 0.7347222222222222 | 29.823 |
| 0.7354166666666666 | 29.823 |
| 0.7361111111111112 | 29.823 |
| 0.7368055555555556 | 25.419 |
| 0.7374999999999999 | 21.024 |
| 0.7381944444444444 | 21.024 |
| 0.7388888888888889 | 21.024 |
| 0.7395833333333334 | 16.636 |
| 0.7402777777777777 | 16.636 |
| 0.7409722222222223 | 12.257 |
| 0.7416666666666667 | 12.257 |
| 0.7423611111111111 | 12.257 |
| 0.7430555555555555 | 12.257 |
| 0.74375 | 12.257 |
| 0.7444444444444445 | 12.257 |
| 0.7451388888888889 | 12.257 |
| 0.7458333333333332 | 7.887 |
| 0.7465277777777778 | 7.887 |
| 0.7472222222222222 | 7.887 |
| 0.7479166666666667 | 7.887 |
| 0.748611111111111 | 7.887 |
| 0.7493055555555556 | 7.887 |
| 0.75 | 7.887 |
| 0.7506944444444444 | 3.525 |
| 0.751388888888889 | 3.525 |
| 0.7520833333333333 | 3.525 |
| 0.7527777777777778 | 3.525 |
| 0.7534722222222222 | 3.525 |
| 0.7541666666666668 | 3.525 |
| 0.7548611111111111 | 3.525 |
| 0.7555555555555555 | 3.525 |
| 0.75625 | 3.525 |
| 0.7569444444444445 | 3.525 |
| 0.7576388888888889 | 3.525 |
| 0.7583333333333333 | 3.525 |
| 0.7590277777777777 | 3.525 |
| 0.7597222222222223 | 3.525 |
| 0.7604166666666666 | 0 |
| 0.7611111111111111 | 0 |
| 0.7618055555555556 | 0 |
| 0.7625000000000001 | 0 |
| 0.7631944444444444 | 0 |
| 0.7638888888888888 | 0 |
| 0.7645833333333334 | 0 |
| 0.7652777777777778 | 0 |
| 0.7659722222222222 | 0 |
| 0.7666666666666666 | 0 |
| 0.7673611111111112 | 0 |
| 0.7680555555555556 | 0 |
| 0.7687499999999999 | 0 |
| 0.7694444444444444 | 0 |
| 0.7701388888888889 | 0 |
| 0.7708333333333334 | 0 |
| 0.7715277777777777 | 0 |
| 0.7722222222222223 | 0 |
| 0.7729166666666667 | 0 |
| 0.7736111111111111 | 0 |
| 0.7743055555555555 | 0 |
| 0.775 | 0 |
| 0.7756944444444445 | 0 |
| 0.7763888888888889 | 0 |
| 0.7770833333333332 | 0 |
| 0.7777777777777778 | 0 |
| 0.7784722222222222 | 0 |
| 0.7791666666666667 | 0 |
| 0.779861111111111 | 0 |
| 0.7805555555555556 | 0 |
| 0.78125 | 0 |
| 0.7819444444444444 | 0 |
| 0.782638888888889 | 0 |
| 0.7833333333333333 | 0 |
| 0.7840277777777778 | 0 |
| 0.7847222222222222 | 0 |
| 0.7854166666666668 | 0 |
| 0.7861111111111111 | 0 |
| 0.7868055555555555 | 0 |
| 0.7875 | 0 |
| 0.7881944444444445 | 0 |
| 0.7888888888888889 | 0 |
| 0.7895833333333333 | 0 |
| 0.7902777777777777 | 0 |
| 0.7909722222222223 | 0 |
| 0.7916666666666666 | 0 |
| 0.7923611111111111 | 0 |
| 0.7930555555555556 | 0 |
| 0.7937500000000001 | 0 |
| 0.7944444444444444 | 0 |
| 0.7951388888888888 | 0 |
| 0.7958333333333334 | 0 |
| 0.7965277777777778 | 0 |
| 0.7972222222222222 | 0 |
| 0.7979166666666666 | 0 |
| 0.7986111111111112 | 0 |
| 0.7993055555555556 | 0 |
| 0.7999999999999999 | 0 |
| 0.8006944444444444 | 0 |
| 0.8013888888888889 | 0 |
| 0.8020833333333334 | 0 |
| 0.8027777777777777 | 0 |
| 0.8034722222222223 | 0 |
| 0.8041666666666667 | 0 |
| 0.8048611111111111 | 0 |
| 0.8055555555555555 | 0 |
| 0.80625 | 0 |
| 0.8069444444444445 | 0 |
| 0.8076388888888889 | 0 |
| 0.8083333333333332 | 0 |
| 0.8090277777777778 | 0 |
| 0.8097222222222222 | 0 |
| 0.8104166666666667 | 0 |
| 0.811111111111111 | 0 |
| 0.8118055555555556 | 0 |
| 0.8125 | 0 |
| 0.8131944444444444 | 0 |
| 0.813888888888889 | 0 |
| 0.8145833333333333 | 0 |
| 0.8152777777777778 | 0 |
| 0.8159722222222222 | 0 |
| 0.8166666666666668 | 0 |
| 0.8173611111111111 | 0 |
| 0.8180555555555555 | 0 |
| 0.81875 | 0 |
| 0.8194444444444445 | 0 |
| 0.8201388888888889 | 0 |
| 0.8208333333333333 | 0 |
| 0.8215277777777777 | 0 |
| 0.8222222222222223 | 0 |
| 0.8229166666666666 | 0 |
| 0.8236111111111111 | 0 |
| 0.8243055555555556 | 0 |
| 0.8250000000000001 | 0 |
| 0.8256944444444444 | 0 |
| 0.8263888888888888 | 0 |
| 0.8270833333333334 | 0 |
| 0.8277777777777778 | 0 |
| 0.8284722222222222 | 0 |
| 0.8291666666666666 | 0 |
| 0.8298611111111112 | 0 |
| 0.8305555555555556 | 0 |
| 0.8312499999999999 | 0 |
| 0.8319444444444444 | 0 |
| 0.8326388888888889 | 0 |
| 0.8333333333333334 | 0 |
| 0.8340277777777777 | 0 |
| 0.8347222222222223 | 0 |
| 0.8354166666666667 | 0 |
| 0.8361111111111111 | 0 |
| 0.8368055555555555 | 0 |
| 0.8375 | 0 |
| 0.8381944444444445 | 0 |
| 0.8388888888888889 | 0 |
| 0.8395833333333332 | 0 |
| 0.8402777777777778 | 0 |
| 0.8409722222222222 | 0 |
| 0.8416666666666667 | 0 |
| 0.842361111111111 | 0 |
| 0.8430555555555556 | 0 |
| 0.84375 | 0 |
| 0.8444444444444444 | 0 |
| 0.845138888888889 | 0 |
| 0.8458333333333333 | 0 |
| 0.8465277777777778 | 0 |
| 0.8472222222222222 | 0 |
| 0.8479166666666668 | 0 |
| 0.8486111111111111 | 0 |
| 0.8493055555555555 | 0 |
| 0.85 | 0 |
| 0.8506944444444445 | 0 |
| 0.8513888888888889 | 0 |
| 0.8520833333333333 | 0 |
| 0.8527777777777777 | 0 |
| 0.8534722222222223 | 0 |
| 0.8541666666666666 | 0 |
| 0.8548611111111111 | 0 |
| 0.8555555555555556 | 0 |
| 0.8562500000000001 | 0 |
| 0.8569444444444444 | 0 |
| 0.8576388888888888 | 0 |
| 0.8583333333333334 | 0 |
| 0.8590277777777778 | 0 |
| 0.8597222222222222 | 0 |
| 0.8604166666666666 | 0 |
| 0.8611111111111112 | 0 |
| 0.8618055555555556 | 0 |
| 0.8624999999999999 | 0 |
| 0.8631944444444444 | 0 |
| 0.8638888888888889 | 0 |
| 0.8645833333333334 | 0 |
| 0.8652777777777777 | 0 |
| 0.8659722222222223 | 0 |
| 0.8666666666666667 | 0 |
| 0.8673611111111111 | 0 |
| 0.8680555555555555 | 0 |
| 0.86875 | 0 |
| 0.8694444444444445 | 0 |
| 0.8701388888888889 | 0 |
| 0.8708333333333332 | 0 |
| 0.8715277777777778 | 0 |
| 0.8722222222222222 | 0 |
| 0.8729166666666667 | 0 |
| 0.873611111111111 | 0 |
| 0.8743055555555556 | 0 |
| 0.875 | 0 |
| 0.8756944444444444 | 0 |
| 0.876388888888889 | 0 |
| 0.8770833333333333 | 0 |
| 0.8777777777777778 | 0 |
| 0.8784722222222222 | 0 |
| 0.8791666666666668 | 0 |
| 0.8798611111111111 | 0 |
| 0.8805555555555555 | 0 |
| 0.88125 | 0 |
| 0.8819444444444445 | 0 |
| 0.8826388888888889 | 0 |
| 0.8833333333333333 | 0 |
| 0.8840277777777777 | 0 |
| 0.8847222222222223 | 0 |
| 0.8854166666666666 | 0 |
| 0.8861111111111111 | 0 |
| 0.8868055555555556 | 0 |
| 0.8875000000000001 | 0 |
| 0.8881944444444444 | 0 |
| 0.8888888888888888 | 0 |
| 0.8895833333333334 | 0 |
| 0.8902777777777778 | 0 |
| 0.8909722222222222 | 0 |
| 0.8916666666666666 | 0 |
| 0.8923611111111112 | 0 |
| 0.8930555555555556 | 0 |
| 0.8937499999999999 | 0 |
| 0.8944444444444444 | 0 |
| 0.8951388888888889 | 0 |
| 0.8958333333333334 | 0 |
| 0.8965277777777777 | 0 |
| 0.8972222222222223 | 0 |
| 0.8979166666666667 | 0 |
| 0.8986111111111111 | 0 |
| 0.8993055555555555 | 0 |
| 0.9 | 0 |
| 0.9006944444444445 | 0 |
| 0.9013888888888889 | 0 |
| 0.9020833333333332 | 0 |
| 0.9027777777777778 | 0 |
| 0.9034722222222222 | 0 |
| 0.9041666666666667 | 0 |
| 0.904861111111111 | 0 |
| 0.9055555555555556 | 0 |
| 0.90625 | 0 |
| 0.9069444444444444 | 0 |
| 0.907638888888889 | 0 |
| 0.9083333333333333 | 0 |
| 0.9090277777777778 | 0 |
| 0.9097222222222222 | 0 |
| 0.9104166666666668 | 0 |
| 0.9111111111111111 | 0 |
| 0.9118055555555555 | 0 |
| 0.9125 | 0 |
| 0.9131944444444445 | 0 |
| 0.9138888888888889 | 0 |
| 0.9145833333333333 | 0 |
| 0.9152777777777777 | 0 |
| 0.9159722222222223 | 0 |
| 0.9166666666666666 | 0 |
| 0.9173611111111111 | 0 |
| 0.9180555555555556 | 0 |
| 0.9187500000000001 | 0 |
| 0.9194444444444444 | 0 |
| 0.9201388888888888 | 0 |
| 0.9208333333333334 | 0 |
| 0.9215277777777778 | 0 |
| 0.9222222222222222 | 0 |
| 0.9229166666666666 | 0 |
| 0.9236111111111112 | 0 |
| 0.9243055555555556 | 0 |
| 0.9249999999999999 | 0 |
| 0.9256944444444444 | 0 |
| 0.9263888888888889 | 0 |
| 0.9270833333333334 | 0 |
| 0.9277777777777777 | 0 |
| 0.9284722222222223 | 0 |
| 0.9291666666666667 | 0 |
| 0.9298611111111111 | 0 |
| 0.9305555555555555 | 0 |
| 0.93125 | 0 |
| 0.9319444444444445 | 0 |
| 0.9326388888888889 | 0 |
| 0.9333333333333332 | 0 |
| 0.9340277777777778 | 0 |
| 0.9347222222222222 | 0 |
| 0.9354166666666667 | 0 |
| 0.936111111111111 | 0 |
| 0.9368055555555556 | 0 |
| 0.9375 | 0 |
| 0.9381944444444444 | 0 |
| 0.938888888888889 | 0 |
| 0.9395833333333333 | 0 |
| 0.9402777777777778 | 0 |
| 0.9409722222222222 | 0 |
| 0.9416666666666668 | 0 |
| 0.9423611111111111 | 0 |
| 0.9430555555555555 | 0 |
| 0.94375 | 0 |
| 0.9444444444444445 | 0 |
| 0.9451388888888889 | 0 |
| 0.9458333333333333 | 0 |
| 0.9465277777777777 | 0 |
| 0.9472222222222223 | 0 |
| 0.9479166666666666 | 0 |
| 0.9486111111111111 | 0 |
| 0.9493055555555556 | 0 |
| 0.9500000000000001 | 0 |
| 0.9506944444444444 | 0 |
| 0.9513888888888888 | 0 |
| 0.9520833333333334 | 0 |
| 0.9527777777777778 | 0 |
| 0.9534722222222222 | 0 |
| 0.9541666666666666 | 0 |
| 0.9548611111111112 | 0 |
| 0.9555555555555556 | 0 |
| 0.9562499999999999 | 0 |
| 0.9569444444444444 | 0 |
| 0.9576388888888889 | 0 |
| 0.9583333333333334 | 0 |
| 0.9590277777777777 | 0 |
| 0.9597222222222223 | 0 |
| 0.9604166666666667 | 0 |
| 0.9611111111111111 | 0 |
| 0.9618055555555555 | 0 |
| 0.9625 | 0 |
| 0.9631944444444445 | 0 |
| 0.9638888888888889 | 0 |
| 0.9645833333333332 | 0 |
| 0.9652777777777778 | 0 |
| 0.9659722222222222 | 0 |
| 0.9666666666666667 | 0 |
| 0.967361111111111 | 0 |
| 0.9680555555555556 | 0 |
| 0.96875 | 0 |
| 0.9694444444444444 | 0 |
| 0.970138888888889 | 0 |
| 0.9708333333333333 | 0 |
| 0.9715277777777778 | 0 |
| 0.9722222222222222 | 0 |
| 0.9729166666666668 | 0 |
| 0.9736111111111111 | 0 |
| 0.9743055555555555 | 0 |
| 0.975 | 0 |
| 0.9756944444444445 | 0 |
| 0.9763888888888889 | 0 |
| 0.9770833333333333 | 0 |
| 0.9777777777777777 | 0 |
| 0.9784722222222223 | 0 |
| 0.9791666666666666 | 0 |
| 0.9798611111111111 | 0 |
| 0.9805555555555556 | 0 |
| 0.9812500000000001 | 0 |
| 0.9819444444444444 | 0 |
| 0.9826388888888888 | 0 |
| 0.9833333333333334 | 0 |
| 0.9840277777777778 | 0 |
| 0.9847222222222222 | 0 |
| 0.9854166666666666 | 0 |
| 0.9861111111111112 | 0 |
| 0.9868055555555556 | 0 |
| 0.9874999999999999 | 0 |
| 0.9881944444444444 | 0 |
| 0.9888888888888889 | 0 |
| 0.9895833333333334 | 0 |
| 0.9902777777777777 | 0 |
| 0.9909722222222223 | 0 |
| 0.9916666666666667 | 0 |
| 0.9923611111111111 | 0 |
| 0.9930555555555555 | 0 |
| 0.99375 | 0 |
| 0.9944444444444445 | 0 |
| 0.9951388888888889 | 0 |
| 0.9958333333333332 | 0 |
| 0.9965277777777778 | 0 |
| 0.9972222222222222 | 0 |
| 0.9979166666666667 | 0 |
| 0.998611111111111 | 0 |
| 0.9993055555555556 | 0 |